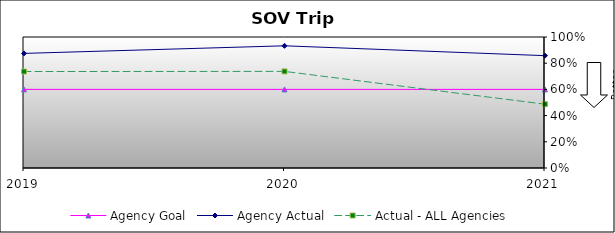
| Category | Agency Goal | Agency Actual | Actual - ALL Agencies |
|---|---|---|---|
| 2019.0 | 0.6 | 0.875 | 0.736 |
| 2020.0 | 0.6 | 0.933 | 0.737 |
| 2021.0 | 0.6 | 0.858 | 0.487 |